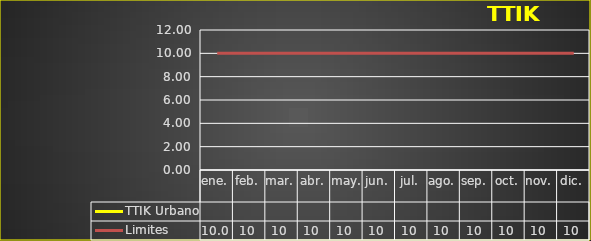
| Category | TTIK Urbano | Limites |
|---|---|---|
| ene. |  | 10 |
| feb. |  | 10 |
| mar. |  | 10 |
| abr. |  | 10 |
| may. |  | 10 |
| jun. |  | 10 |
| jul. |  | 10 |
| ago. |  | 10 |
| sep. |  | 10 |
| oct. |  | 10 |
| nov. |  | 10 |
| dic. |  | 10 |